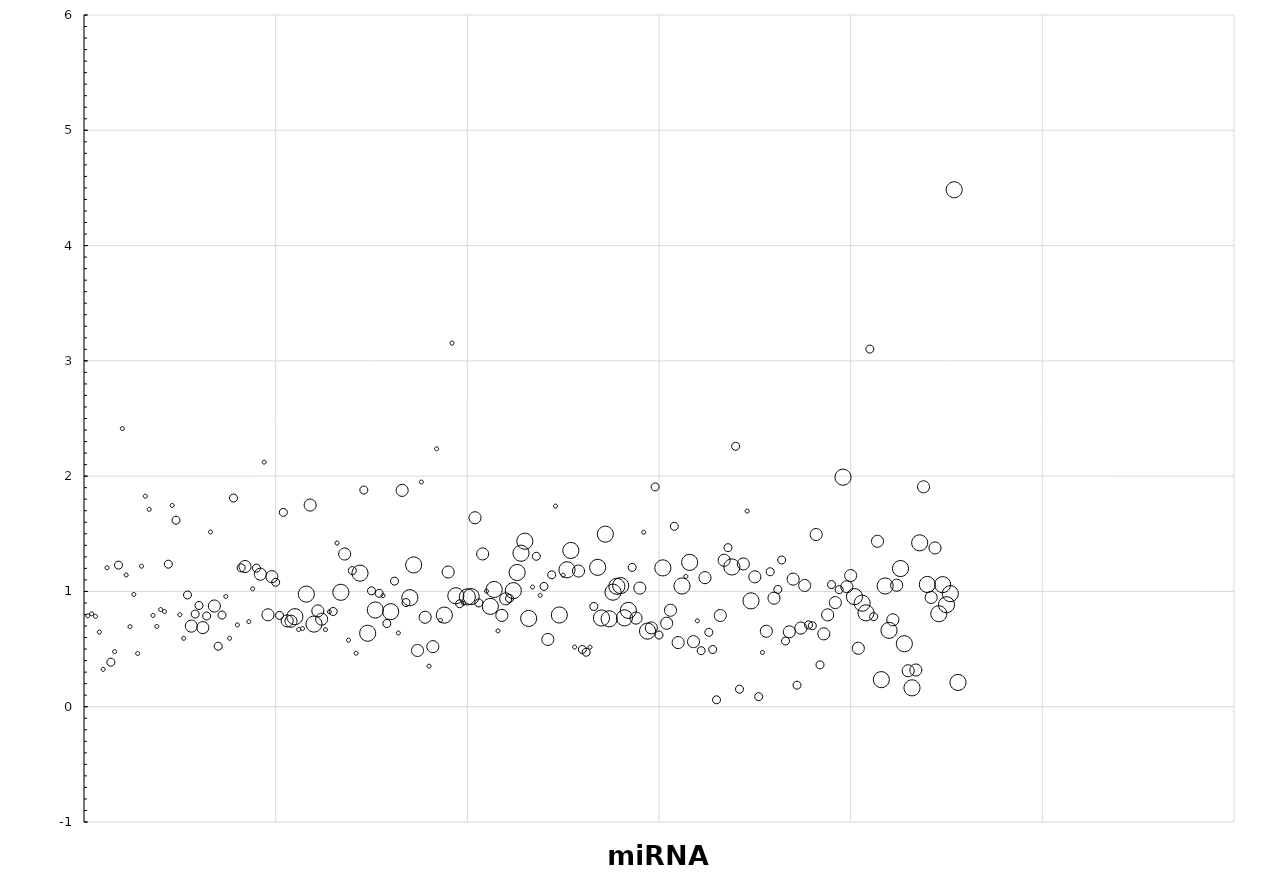
| Category | ΔΔrank = ΔSIPS-ΔQ |
|---|---|
| 0 | 0.789 |
| 1 | 0.806 |
| 2 | 0.784 |
| 3 | 0.648 |
| 4 | 0.324 |
| 5 | 1.206 |
| 6 | 0.386 |
| 7 | 0.478 |
| 8 | 1.228 |
| 9 | 2.413 |
| 10 | 1.143 |
| 11 | 0.694 |
| 12 | 0.974 |
| 13 | 0.462 |
| 14 | 1.219 |
| 15 | 1.826 |
| 16 | 1.712 |
| 17 | 0.792 |
| 18 | 0.697 |
| 19 | 0.843 |
| 20 | 0.826 |
| 21 | 1.236 |
| 22 | 1.746 |
| 23 | 1.618 |
| 24 | 0.798 |
| 25 | 0.593 |
| 26 | 0.969 |
| 27 | 0.699 |
| 28 | 0.804 |
| 29 | 0.878 |
| 30 | 0.686 |
| 31 | 0.787 |
| 32 | 1.516 |
| 33 | 0.873 |
| 34 | 0.525 |
| 35 | 0.795 |
| 36 | 0.956 |
| 37 | 0.594 |
| 38 | 1.81 |
| 39 | 0.71 |
| 40 | 1.204 |
| 41 | 1.216 |
| 42 | 0.738 |
| 43 | 1.023 |
| 44 | 1.202 |
| 45 | 1.149 |
| 46 | 2.122 |
| 47 | 0.797 |
| 48 | 1.128 |
| 49 | 1.079 |
| 50 | 0.792 |
| 51 | 1.686 |
| 52 | 0.744 |
| 53 | 0.741 |
| 54 | 0.781 |
| 55 | 0.67 |
| 56 | 0.678 |
| 57 | 0.977 |
| 58 | 1.749 |
| 59 | 0.717 |
| 60 | 0.831 |
| 61 | 0.759 |
| 62 | 0.669 |
| 63 | 0.823 |
| 64 | 0.826 |
| 65 | 1.42 |
| 66 | 0.992 |
| 67 | 1.324 |
| 68 | 0.577 |
| 69 | 1.181 |
| 70 | 0.464 |
| 71 | 1.159 |
| 72 | 1.879 |
| 73 | 0.637 |
| 74 | 1.005 |
| 75 | 0.839 |
| 76 | 0.983 |
| 77 | 0.964 |
| 78 | 0.722 |
| 79 | 0.824 |
| 80 | 1.089 |
| 81 | 0.64 |
| 82 | 1.876 |
| 83 | 0.904 |
| 84 | 0.946 |
| 85 | 1.23 |
| 86 | 0.488 |
| 87 | 1.949 |
| 88 | 0.776 |
| 89 | 0.351 |
| 90 | 0.521 |
| 91 | 2.237 |
| 92 | 0.749 |
| 93 | 0.795 |
| 94 | 1.169 |
| 95 | 3.154 |
| 96 | 0.962 |
| 97 | 0.893 |
| 98 | 0.896 |
| 99 | 0.953 |
| 100 | 0.955 |
| 101 | 1.639 |
| 102 | 0.9 |
| 103 | 1.325 |
| 104 | 1.002 |
| 105 | 0.87 |
| 106 | 1.017 |
| 107 | 0.658 |
| 108 | 0.792 |
| 109 | 0.936 |
| 110 | 0.939 |
| 111 | 1.007 |
| 112 | 1.164 |
| 113 | 1.331 |
| 114 | 1.435 |
| 115 | 0.766 |
| 116 | 1.038 |
| 117 | 1.305 |
| 118 | 0.966 |
| 119 | 1.043 |
| 120 | 0.583 |
| 121 | 1.144 |
| 122 | 1.74 |
| 123 | 0.796 |
| 124 | 1.14 |
| 125 | 1.188 |
| 126 | 1.355 |
| 127 | 0.517 |
| 128 | 1.177 |
| 129 | 0.497 |
| 130 | 0.473 |
| 131 | 0.516 |
| 132 | 0.869 |
| 133 | 1.209 |
| 134 | 0.769 |
| 135 | 1.497 |
| 136 | 0.762 |
| 137 | 0.994 |
| 138 | 1.044 |
| 139 | 1.051 |
| 140 | 0.771 |
| 141 | 0.835 |
| 142 | 1.208 |
| 143 | 0.769 |
| 144 | 1.029 |
| 145 | 1.513 |
| 146 | 0.656 |
| 147 | 0.684 |
| 148 | 1.907 |
| 149 | 0.622 |
| 150 | 1.204 |
| 151 | 0.724 |
| 152 | 0.837 |
| 153 | 1.565 |
| 154 | 0.556 |
| 155 | 1.047 |
| 156 | 1.13 |
| 157 | 1.252 |
| 158 | 0.564 |
| 159 | 0.745 |
| 160 | 0.486 |
| 161 | 1.119 |
| 162 | 0.645 |
| 163 | 0.496 |
| 164 | 0.06 |
| 165 | 0.791 |
| 166 | 1.27 |
| 167 | 1.379 |
| 168 | 1.212 |
| 169 | 2.259 |
| 170 | 0.152 |
| 171 | 1.239 |
| 172 | 1.697 |
| 173 | 0.918 |
| 174 | 1.127 |
| 175 | 0.087 |
| 176 | 0.471 |
| 177 | 0.655 |
| 178 | 1.171 |
| 179 | 0.941 |
| 180 | 1.017 |
| 181 | 1.273 |
| 182 | 0.57 |
| 183 | 0.65 |
| 184 | 1.107 |
| 185 | 0.187 |
| 186 | 0.682 |
| 187 | 1.052 |
| 188 | 0.71 |
| 189 | 0.703 |
| 190 | 1.494 |
| 191 | 0.363 |
| 192 | 0.632 |
| 193 | 0.797 |
| 194 | 1.059 |
| 195 | 0.903 |
| 196 | 1.015 |
| 197 | 1.991 |
| 198 | 1.041 |
| 199 | 1.138 |
| 200 | 0.955 |
| 201 | 0.507 |
| 202 | 0.898 |
| 203 | 0.814 |
| 204 | 3.102 |
| 205 | 0.781 |
| 206 | 1.435 |
| 207 | 0.235 |
| 208 | 1.047 |
| 209 | 0.662 |
| 210 | 0.754 |
| 211 | 1.054 |
| 212 | 1.198 |
| 213 | 0.546 |
| 214 | 0.312 |
| 215 | 0.164 |
| 216 | 0.318 |
| 217 | 1.422 |
| 218 | 1.907 |
| 219 | 1.06 |
| 220 | 0.948 |
| 221 | 1.377 |
| 222 | 0.806 |
| 223 | 1.059 |
| 224 | 0.885 |
| 225 | 0.981 |
| 226 | 4.484 |
| 227 | 0.211 |